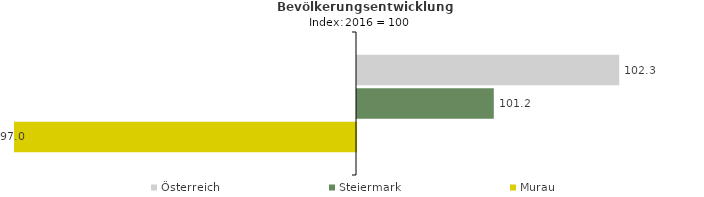
| Category | Österreich | Steiermark | Murau |
|---|---|---|---|
| 2020.0 | 102.3 | 101.2 | 97 |